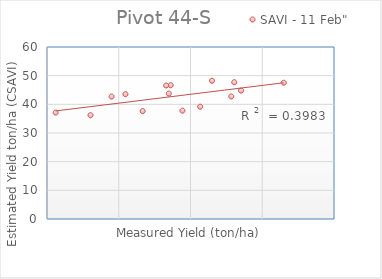
| Category | SAVI - 11 Feb" |
|---|---|
| 42.240001 | 46.666 |
| 41.599998 | 46.572 |
| 34.0 | 42.701 |
| 41.972999 | 43.747 |
| 26.202999 | 37.111 |
| 31.062999 | 36.202 |
| 52.049999 | 44.798 |
| 35.932998 | 43.52 |
| 51.099998 | 47.716 |
| 50.682998 | 42.75 |
| 46.349998 | 39.168 |
| 58.0 | 47.531 |
| 43.876998 | 37.789 |
| 38.333 | 37.632 |
| 47.993 | 48.222 |